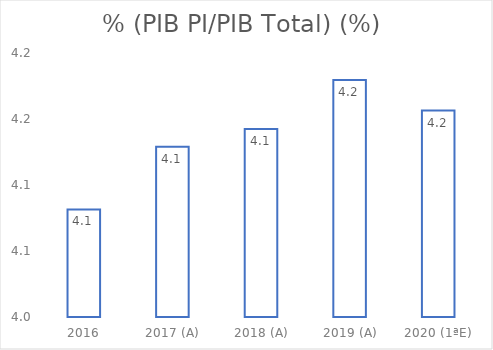
| Category | % (PIB PI/PIB Total) (%) |
|---|---|
| 2016 | 4.081 |
| 2017 (A) | 4.129 |
| 2018 (A) | 4.142 |
| 2019 (A) | 4.18 |
| 2020 (1ªE) | 4.156 |